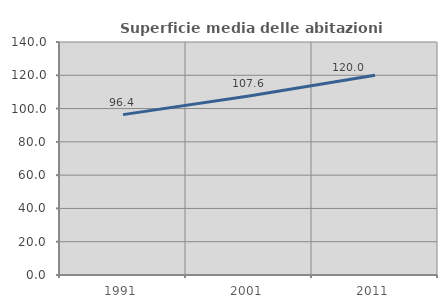
| Category | Superficie media delle abitazioni occupate |
|---|---|
| 1991.0 | 96.363 |
| 2001.0 | 107.577 |
| 2011.0 | 120.037 |